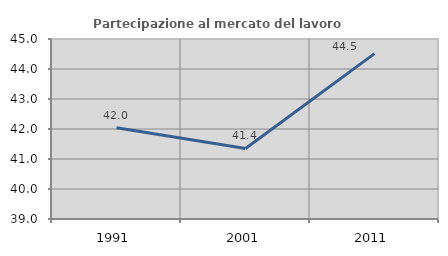
| Category | Partecipazione al mercato del lavoro  femminile |
|---|---|
| 1991.0 | 42.038 |
| 2001.0 | 41.35 |
| 2011.0 | 44.513 |